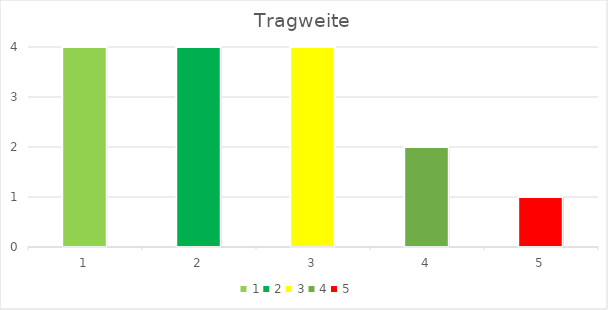
| Category | Tragweite |
|---|---|
| 1.0 | 9 |
| 2.0 | 5 |
| 3.0 | 6 |
| 4.0 | 2 |
| 5.0 | 1 |